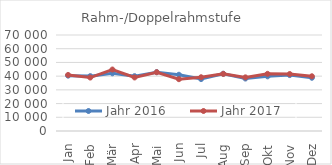
| Category | Jahr 2016 | Jahr 2017 |
|---|---|---|
| 0 | 40352.678 | 40871.54 |
| 1 | 40013.698 | 38979.407 |
| 2 | 42068.506 | 44824.665 |
| 3 | 39977.987 | 39037.643 |
| 4 | 42894.171 | 42876.699 |
| 5 | 41011.601 | 37783.183 |
| 6 | 37862.412 | 39187.191 |
| 7 | 41758.655 | 41641.311 |
| 8 | 38257.361 | 39112.868 |
| 9 | 39852.215 | 41687.42 |
| 10 | 40768.245 | 41535.688 |
| 11 | 38815.155 | 39906.662 |